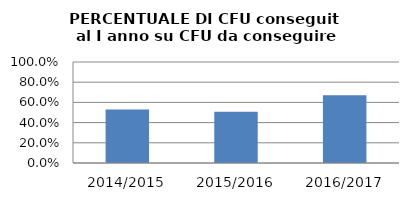
| Category | 2014/2015 2015/2016 2016/2017 |
|---|---|
| 2014/2015 | 0.529 |
| 2015/2016 | 0.507 |
| 2016/2017 | 0.671 |